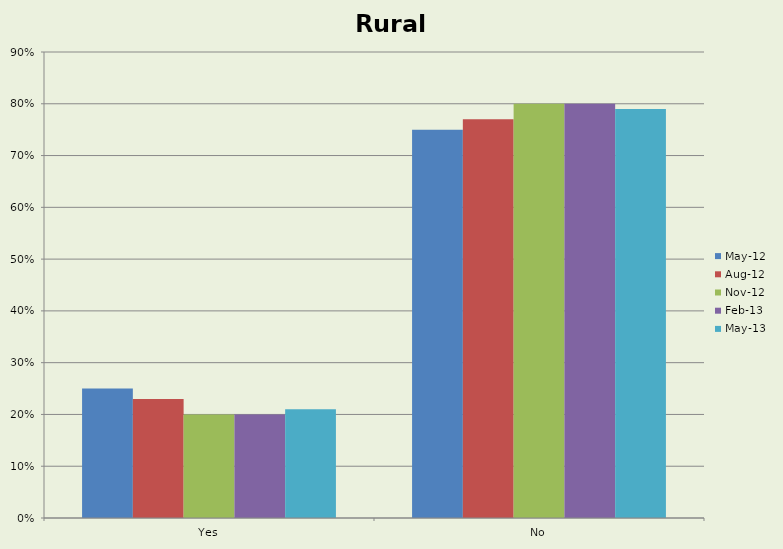
| Category | May-12 | Aug-12 | Nov-12 | Feb-13 | May-13 |
|---|---|---|---|---|---|
| Yes | 0.25 | 0.23 | 0.2 | 0.2 | 0.21 |
| No | 0.75 | 0.77 | 0.8 | 0.8 | 0.79 |